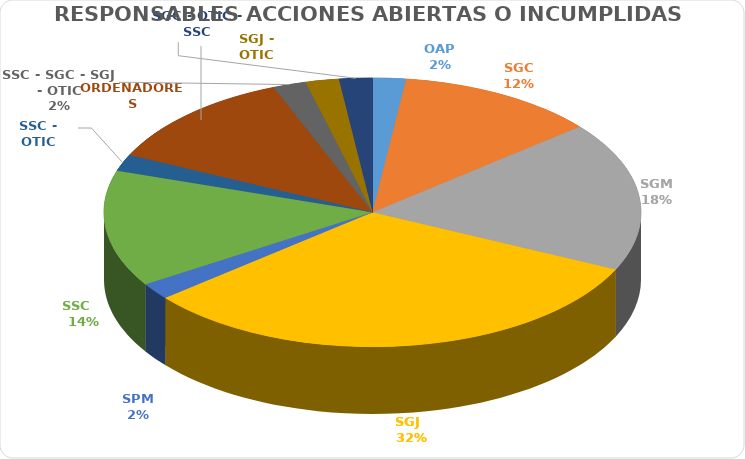
| Category | Series 0 |
|---|---|
| OAP | 1 |
| SGC | 6 |
| SGM | 9 |
| SGJ   | 16 |
| SPM | 1 |
| SSC    | 7 |
| SSC - OTIC | 1 |
| ORDENADORES | 6 |
| SSC - SGC - SGJ - OTIC | 1 |
| SGJ - OTIC | 1 |
| SGC - OTIC - SSC | 1 |